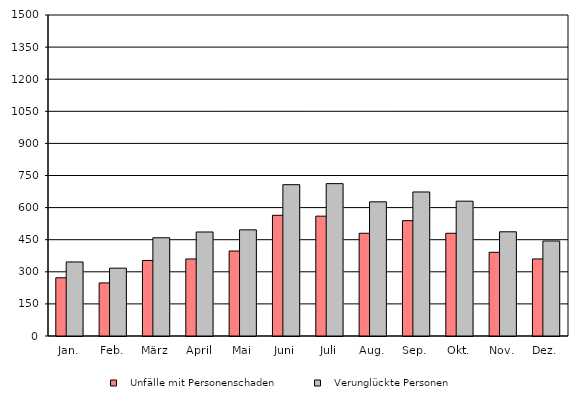
| Category |    Unfälle mit Personenschaden |    Verunglückte Personen |
|---|---|---|
| Jan. | 272 | 346 |
| Feb. | 248 | 317 |
| März | 353 | 459 |
| April | 360 | 486 |
| Mai | 397 | 496 |
| Juni | 564 | 707 |
| Juli | 560 | 712 |
| Aug. | 480 | 627 |
| Sep. | 539 | 673 |
| Okt. | 480 | 630 |
| Nov. | 391 | 487 |
| Dez. | 360 | 444 |